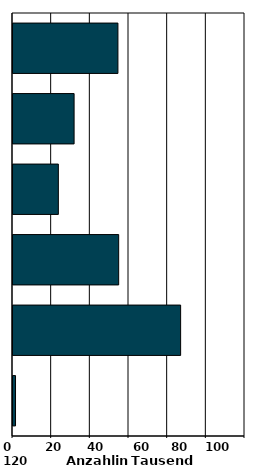
| Category | Series 0 |
|---|---|
| 0 | 1.307 |
| 1 | 86.707 |
| 2 | 54.658 |
| 3 | 23.461 |
| 4 | 31.604 |
| 5 | 54.27 |